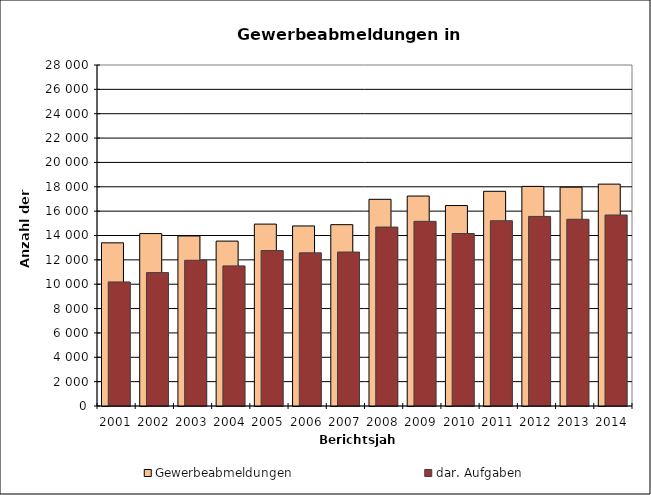
| Category | Gewerbeabmeldungen | dar. Aufgaben |
|---|---|---|
| 2001.0 | 13398 | 10187 |
| 2002.0 | 14158 | 10953 |
| 2003.0 | 13964 | 11965 |
| 2004.0 | 13540 | 11504 |
| 2005.0 | 14936 | 12763 |
| 2006.0 | 14785 | 12576 |
| 2007.0 | 14890 | 12642 |
| 2008.0 | 16972 | 14693 |
| 2009.0 | 17240 | 15163 |
| 2010.0 | 16460 | 14163 |
| 2011.0 | 17629 | 15213 |
| 2012.0 | 18032 | 15567 |
| 2013.0 | 17968 | 15333 |
| 2014.0 | 18219 | 15684 |